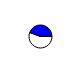
| Category | Series 0 |
|---|---|
| 0 | 19548 |
| 1 | 15599 |